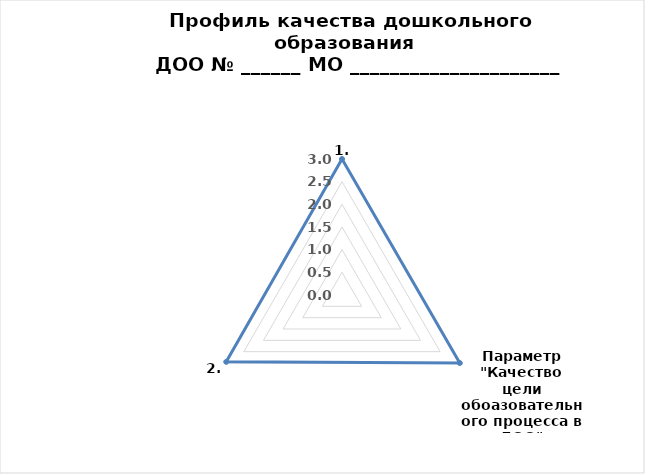
| Category | Оценка  в баллах |
|---|---|
| 0 | 3 |
| 1 | 3 |
| 2 | 2.948 |